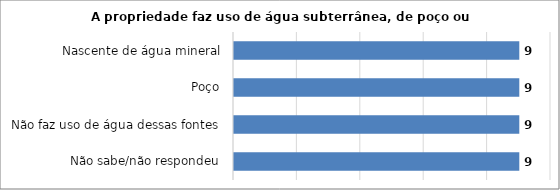
| Category | Series 0 |
|---|---|
| Não sabe/não respondeu | 9 |
| Não faz uso de água dessas fontes | 9 |
| Poço | 9 |
| Nascente de água mineral | 9 |